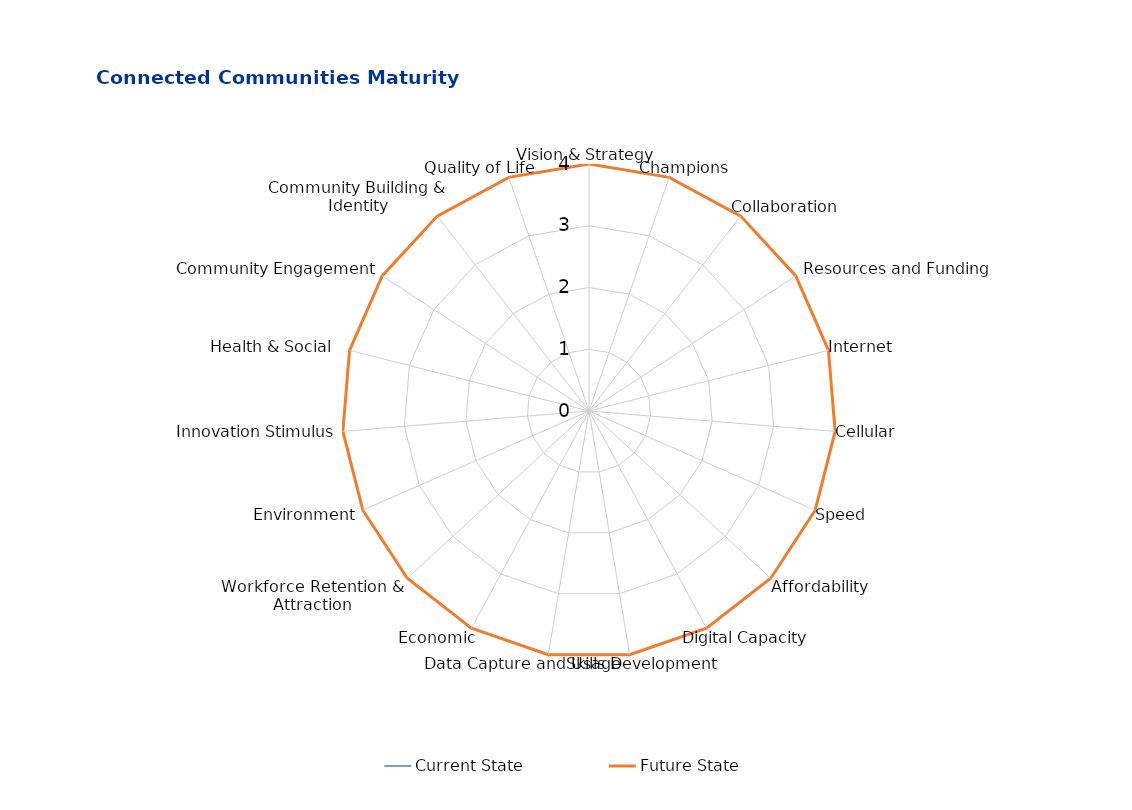
| Category | Current State | Future State |
|---|---|---|
| Vision & Strategy | 0 | 4 |
| Champions  | 0 | 4 |
| Collaboration | 0 | 4 |
| Resources and Funding
 | 0 | 4 |
| Internet | 0 | 4 |
| Cellular | 0 | 4 |
| Speed | 0 | 4 |
| Affordability                           | 0 | 4 |
| Digital Capacity | 0 | 4 |
| Skills Development | 0 | 4 |
| Data Capture and Usage | 0 | 4 |
| Economic  | 0 | 4 |
| Workforce Retention & Attraction | 0 | 4 |
| Environment | 0 | 4 |
| Innovation Stimulus | 0 | 4 |
| Health & Social   | 0 | 4 |
| Community Engagement | 0 | 4 |
| Community Building & Identity | 0 | 4 |
| Quality of Life | 0 | 4 |